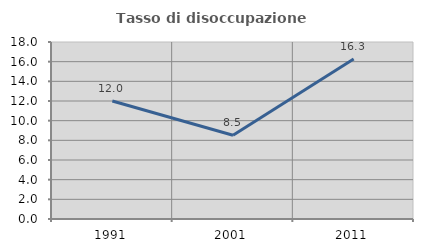
| Category | Tasso di disoccupazione giovanile  |
|---|---|
| 1991.0 | 12 |
| 2001.0 | 8.511 |
| 2011.0 | 16.279 |